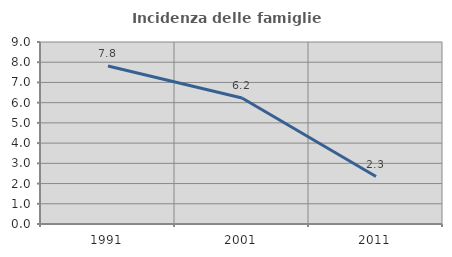
| Category | Incidenza delle famiglie numerose |
|---|---|
| 1991.0 | 7.817 |
| 2001.0 | 6.234 |
| 2011.0 | 2.348 |